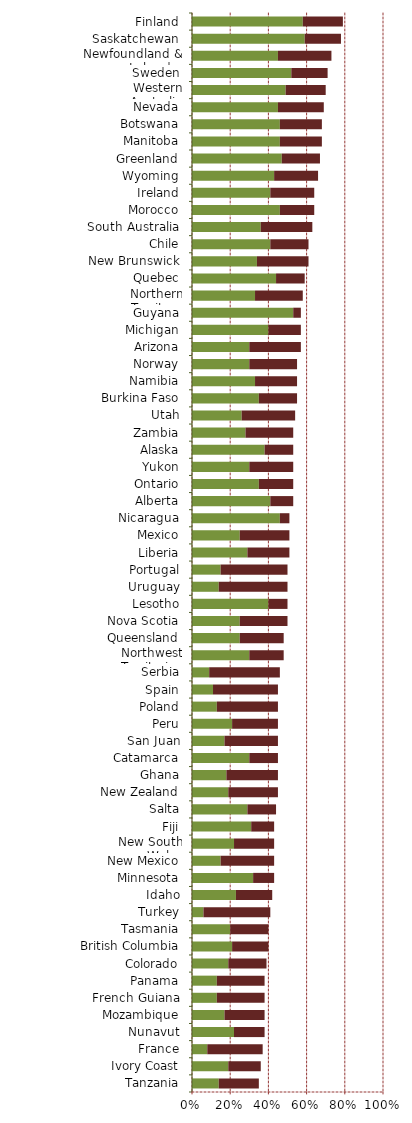
| Category |   Encourages Investment |   Not a Deterrent to Investment |
|---|---|---|
| Tanzania | 0.14 | 0.21 |
| Ivory Coast | 0.19 | 0.17 |
| France | 0.08 | 0.29 |
| Nunavut | 0.22 | 0.16 |
| Mozambique | 0.17 | 0.21 |
| French Guiana | 0.13 | 0.25 |
| Panama | 0.13 | 0.25 |
| Colorado | 0.19 | 0.2 |
| British Columbia | 0.21 | 0.19 |
| Tasmania | 0.2 | 0.2 |
| Turkey | 0.06 | 0.35 |
| Idaho | 0.23 | 0.19 |
| Minnesota | 0.32 | 0.11 |
| New Mexico | 0.15 | 0.28 |
| New South Wales | 0.22 | 0.21 |
| Fiji | 0.31 | 0.12 |
| Salta | 0.29 | 0.15 |
| New Zealand | 0.19 | 0.26 |
| Ghana | 0.18 | 0.27 |
| Catamarca | 0.3 | 0.15 |
| San Juan | 0.17 | 0.28 |
| Peru | 0.21 | 0.24 |
| Poland | 0.13 | 0.32 |
| Spain | 0.11 | 0.34 |
| Serbia | 0.09 | 0.37 |
| Northwest Territories | 0.3 | 0.18 |
| Queensland | 0.25 | 0.23 |
| Nova Scotia | 0.25 | 0.25 |
| Lesotho | 0.4 | 0.1 |
| Uruguay | 0.14 | 0.36 |
| Portugal | 0.15 | 0.35 |
| Liberia | 0.29 | 0.22 |
| Mexico | 0.25 | 0.26 |
| Nicaragua | 0.46 | 0.05 |
| Alberta | 0.41 | 0.12 |
| Ontario | 0.35 | 0.18 |
| Yukon | 0.3 | 0.23 |
| Alaska | 0.38 | 0.15 |
| Zambia | 0.28 | 0.25 |
| Utah | 0.26 | 0.28 |
| Burkina Faso | 0.35 | 0.2 |
| Namibia | 0.33 | 0.22 |
| Norway | 0.3 | 0.25 |
| Arizona | 0.3 | 0.27 |
| Michigan | 0.4 | 0.17 |
| Guyana | 0.53 | 0.04 |
| Northern Territory | 0.33 | 0.25 |
| Quebec | 0.44 | 0.15 |
| New Brunswick | 0.34 | 0.27 |
| Chile | 0.41 | 0.2 |
| South Australia | 0.36 | 0.27 |
| Morocco | 0.46 | 0.18 |
| Ireland | 0.41 | 0.23 |
| Wyoming | 0.43 | 0.23 |
| Greenland | 0.47 | 0.2 |
| Manitoba | 0.46 | 0.22 |
| Botswana | 0.46 | 0.22 |
| Nevada | 0.45 | 0.24 |
| Western Australia | 0.49 | 0.21 |
| Sweden | 0.52 | 0.19 |
| Newfoundland & Labrador | 0.45 | 0.28 |
| Saskatchewan | 0.59 | 0.19 |
| Finland | 0.58 | 0.21 |